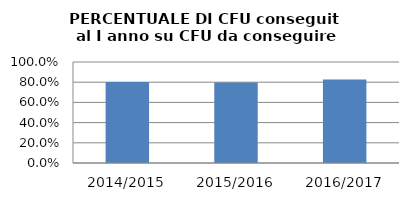
| Category | 2014/2015 2015/2016 2016/2017 |
|---|---|
| 2014/2015 | 0.801 |
| 2015/2016 | 0.797 |
| 2016/2017 | 0.827 |